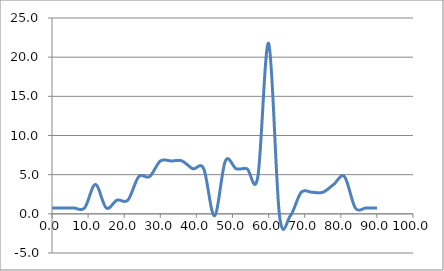
| Category | Elevation (in.) |
|---|---|
| 0.024 | 0.75 |
| 3.024 | 0.75 |
| 6.024 | 0.75 |
| 9.024000000000001 | 0.75 |
| 12.024000000000001 | 3.75 |
| 15.024000000000001 | 0.75 |
| 18.024 | 1.75 |
| 21.024 | 1.75 |
| 24.023999999999997 | 4.75 |
| 27.023999999999997 | 4.75 |
| 30.023999999999997 | 6.75 |
| 33.024 | 6.75 |
| 36.024 | 6.75 |
| 39.024 | 5.75 |
| 42.024 | 5.75 |
| 45.024 | -0.25 |
| 48.024 | 6.75 |
| 51.024 | 5.75 |
| 54.024 | 5.75 |
| 57.024 | 4.75 |
| 60.024 | 21.75 |
| 63.024 | -0.25 |
| 66.024 | -0.25 |
| 69.024 | 2.75 |
| 72.024 | 2.75 |
| 75.024 | 2.75 |
| 78.024 | 3.75 |
| 81.024 | 4.75 |
| 84.024 | 0.75 |
| 87.024 | 0.75 |
| 90.024 | 0.75 |